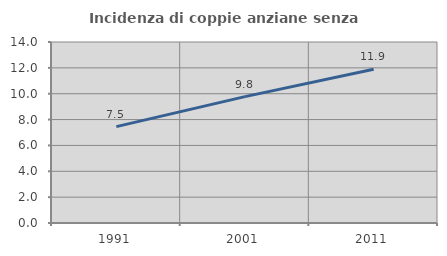
| Category | Incidenza di coppie anziane senza figli  |
|---|---|
| 1991.0 | 7.454 |
| 2001.0 | 9.772 |
| 2011.0 | 11.887 |